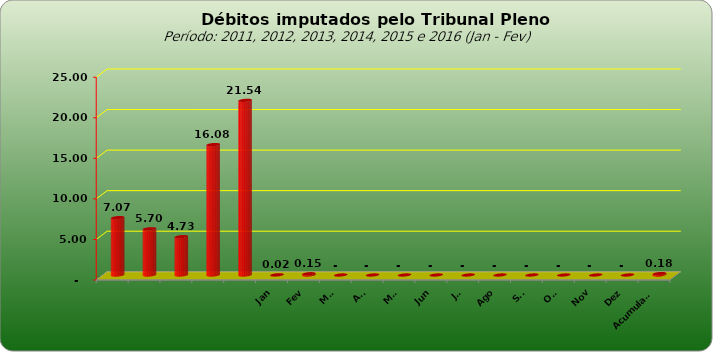
| Category |  7.073.154,74   5.698.720,25   4.727.033,51   16.081.820,48   21.535.723,60   22.059,63   154.318,14   -     -     -     -     -     -     -     -     -     -     176.377,77  |
|---|---|
|  | 7073154.74 |
|  | 5698720.25 |
|  | 4727033.51 |
|  | 16081820.48 |
|  | 21535723.6 |
| Jan | 22059.63 |
| Fev | 154318.14 |
| Mar | 0 |
| Abr | 0 |
| Mai | 0 |
| Jun | 0 |
| Jul | 0 |
| Ago | 0 |
| Set | 0 |
| Out | 0 |
| Nov | 0 |
| Dez | 0 |
| Acumulado | 176377.77 |